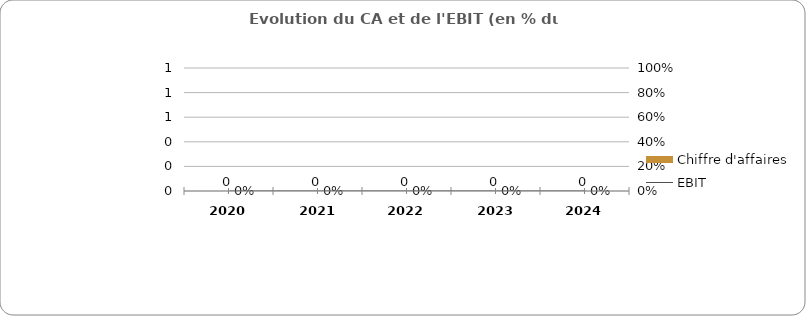
| Category | Chiffre d'affaires |
|---|---|
| 2020.0 | 0 |
| 2021.0 | 0 |
| 2022.0 | 0 |
| 2023.0 | 0 |
| 2024.0 | 0 |